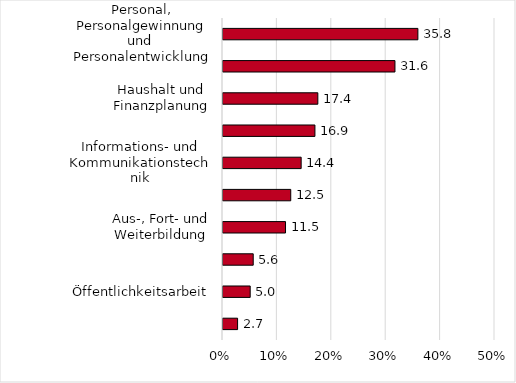
| Category | Series 0 |
|---|---|
| Personal, Personalgewinnung und 
Personalentwicklung | 35.824 |
| Organisation und Organisationsentwicklung | 31.609 |
| Haushalt und Finanzplanung | 17.433 |
| Sonstiges | 16.9 |
| Informations- und Kommunikationstechnik | 14.368 |
| Controlling | 12.452 |
| Aus-, Fort- und Weiterbildung | 11.494 |
| Justiziariat | 5.556 |
| Öffentlichkeitsarbeit | 5 |
| Reiseplanung und 
Reisekostenabrechnung | 2.682 |